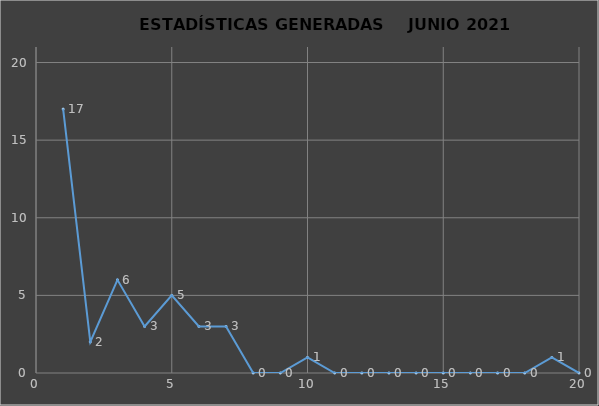
| Category |                   ESTADÍSTICAS GENERADAS     PERÍODO JUNIO 2021 CANTIDAD |
|---|---|
| 0 | 17 |
| 1 | 2 |
| 2 | 6 |
| 3 | 3 |
| 4 | 5 |
| 5 | 3 |
| 6 | 3 |
| 7 | 0 |
| 8 | 0 |
| 9 | 1 |
| 10 | 0 |
| 11 | 0 |
| 12 | 0 |
| 13 | 0 |
| 14 | 0 |
| 15 | 0 |
| 16 | 0 |
| 17 | 0 |
| 18 | 1 |
| 19 | 0 |